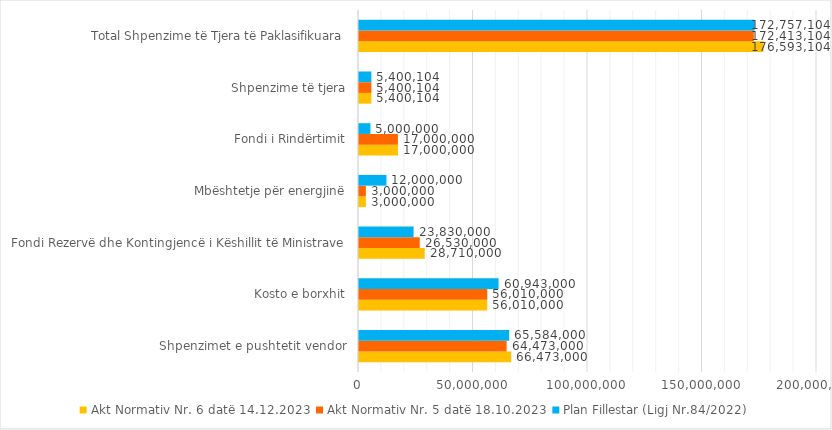
| Category | Akt Normativ Nr. 6 datë 14.12.2023 | Akt Normativ Nr. 5 datë 18.10.2023 | Plan Fillestar (Ligj Nr.84/2022) |
|---|---|---|---|
| Shpenzimet e pushtetit vendor | 66473000 | 64473000 | 65584000 |
| Kosto e borxhit | 56010000 | 56010000 | 60943000 |
| Fondi Rezervë dhe Kontingjencë i Këshillit të Ministrave | 28710000 | 26530000 | 23830000 |
| Mbështetje për energjinë | 3000000 | 3000000 | 12000000 |
| Fondi i Rindërtimit | 17000000 | 17000000 | 5000000 |
| Shpenzime të tjera | 5400104 | 5400104 | 5400104 |
| Total Shpenzime të Tjera të Paklasifikuara | 176593104 | 172413104 | 172757104 |